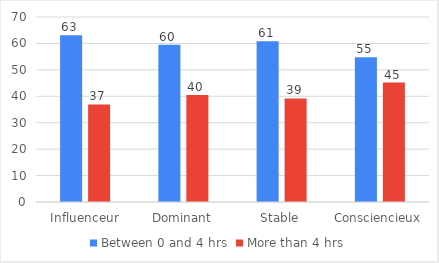
| Category | Between 0 and 4 hrs | More than 4 hrs |
|---|---|---|
| Influenceur | 63.085 | 36.915 |
| Dominant | 59.524 | 40.476 |
| Stable | 60.811 | 39.189 |
| Consciencieux | 54.815 | 45.185 |